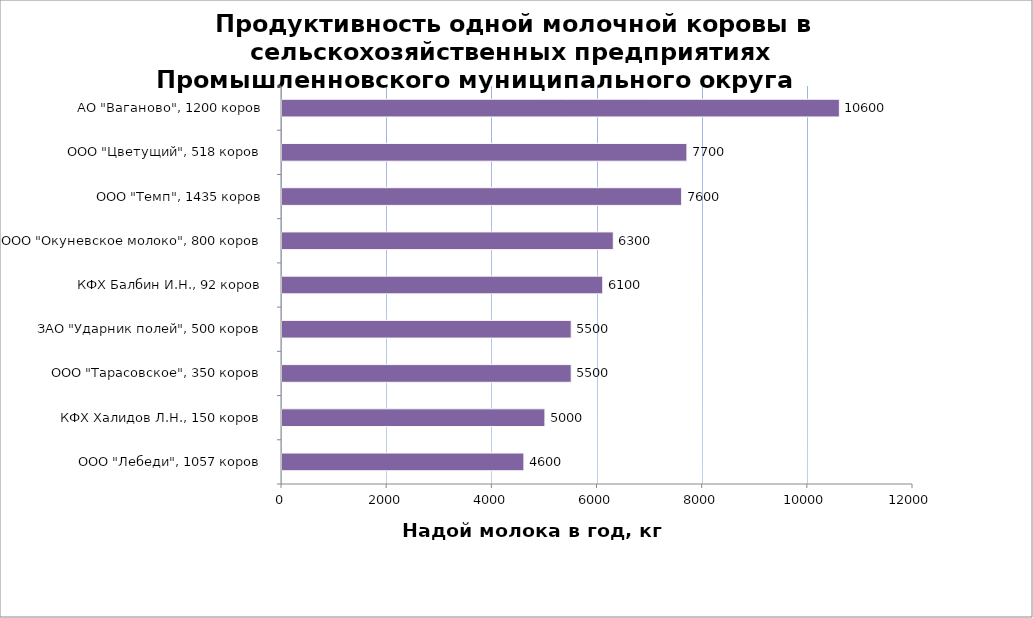
| Category | Series 0 |
|---|---|
| ООО "Лебеди", 1057 коров | 4600 |
| КФХ Халидов Л.Н., 150 коров | 5000 |
| ООО "Тарасовское", 350 коров | 5500 |
| ЗАО "Ударник полей", 500 коров | 5500 |
| КФХ Балбин И.Н., 92 коров | 6100 |
| ООО "Окуневское молоко", 800 коров | 6300 |
| ООО "Темп", 1435 коров | 7600 |
| ООО "Цветущий", 518 коров | 7700 |
| АО "Ваганово", 1200 коров | 10600 |